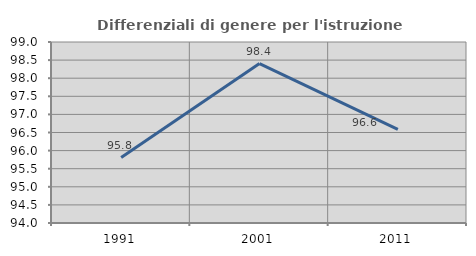
| Category | Differenziali di genere per l'istruzione superiore |
|---|---|
| 1991.0 | 95.809 |
| 2001.0 | 98.404 |
| 2011.0 | 96.585 |